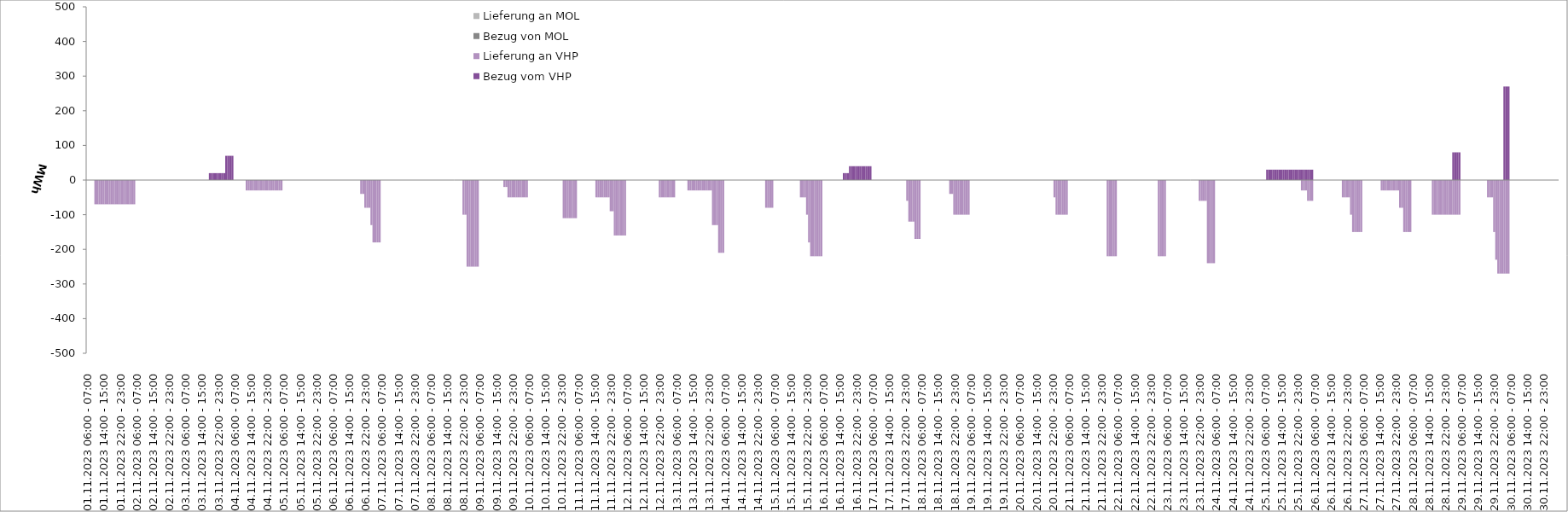
| Category | Bezug vom VHP | Lieferung an VHP | Bezug von MOL | Lieferung an MOL |
|---|---|---|---|---|
| 01.11.2023 06:00 - 07:00 | 0 | 0 | 0 | 0 |
| 01.11.2023 07:00 - 08:00 | 0 | 0 | 0 | 0 |
| 01.11.2023 08:00 - 09:00 | 0 | 0 | 0 | 0 |
| 01.11.2023 09:00 - 10:00 | 0 | 0 | 0 | 0 |
| 01.11.2023 10:00 - 11:00 | 0 | -70 | 0 | 0 |
| 01.11.2023 11:00 - 12:00 | 0 | -70 | 0 | 0 |
| 01.11.2023 12:00 - 13:00 | 0 | -70 | 0 | 0 |
| 01.11.2023 13:00 - 14:00 | 0 | -70 | 0 | 0 |
| 01.11.2023 14:00 - 15:00 | 0 | -70 | 0 | 0 |
| 01.11.2023 15:00 - 16:00 | 0 | -70 | 0 | 0 |
| 01.11.2023 16:00 - 17:00 | 0 | -70 | 0 | 0 |
| 01.11.2023 17:00 - 18:00 | 0 | -70 | 0 | 0 |
| 01.11.2023 18:00 - 19:00 | 0 | -70 | 0 | 0 |
| 01.11.2023 19:00 - 20:00 | 0 | -70 | 0 | 0 |
| 01.11.2023 20:00 - 21:00 | 0 | -70 | 0 | 0 |
| 01.11.2023 21:00 - 22:00 | 0 | -70 | 0 | 0 |
| 01.11.2023 22:00 - 23:00 | 0 | -70 | 0 | 0 |
| 01.11.2023 23:00 - 24:00 | 0 | -70 | 0 | 0 |
| 02.11.2023 00:00 - 01:00 | 0 | -70 | 0 | 0 |
| 02.11.2023 01:00 - 02:00 | 0 | -70 | 0 | 0 |
| 02.11.2023 02:00 - 03:00 | 0 | -70 | 0 | 0 |
| 02.11.2023 03:00 - 04:00 | 0 | -70 | 0 | 0 |
| 02.11.2023 04:00 - 05:00 | 0 | -70 | 0 | 0 |
| 02.11.2023 05:00 - 06:00 | 0 | -70 | 0 | 0 |
| 02.11.2023 06:00 - 07:00 | 0 | 0 | 0 | 0 |
| 02.11.2023 07:00 - 08:00 | 0 | 0 | 0 | 0 |
| 02.11.2023 08:00 - 09:00 | 0 | 0 | 0 | 0 |
| 02.11.2023 09:00 - 10:00 | 0 | 0 | 0 | 0 |
| 02.11.2023 10:00 - 11:00 | 0 | 0 | 0 | 0 |
| 02.11.2023 11:00 - 12:00 | 0 | 0 | 0 | 0 |
| 02.11.2023 12:00 - 13:00 | 0 | 0 | 0 | 0 |
| 02.11.2023 13:00 - 14:00 | 0 | 0 | 0 | 0 |
| 02.11.2023 14:00 - 15:00 | 0 | 0 | 0 | 0 |
| 02.11.2023 15:00 - 16:00 | 0 | 0 | 0 | 0 |
| 02.11.2023 16:00 - 17:00 | 0 | 0 | 0 | 0 |
| 02.11.2023 17:00 - 18:00 | 0 | 0 | 0 | 0 |
| 02.11.2023 18:00 - 19:00 | 0 | 0 | 0 | 0 |
| 02.11.2023 19:00 - 20:00 | 0 | 0 | 0 | 0 |
| 02.11.2023 20:00 - 21:00 | 0 | 0 | 0 | 0 |
| 02.11.2023 21:00 - 22:00 | 0 | 0 | 0 | 0 |
| 02.11.2023 22:00 - 23:00 | 0 | 0 | 0 | 0 |
| 02.11.2023 23:00 - 24:00 | 0 | 0 | 0 | 0 |
| 03.11.2023 00:00 - 01:00 | 0 | 0 | 0 | 0 |
| 03.11.2023 01:00 - 02:00 | 0 | 0 | 0 | 0 |
| 03.11.2023 02:00 - 03:00 | 0 | 0 | 0 | 0 |
| 03.11.2023 03:00 - 04:00 | 0 | 0 | 0 | 0 |
| 03.11.2023 04:00 - 05:00 | 0 | 0 | 0 | 0 |
| 03.11.2023 05:00 - 06:00 | 0 | 0 | 0 | 0 |
| 03.11.2023 06:00 - 07:00 | 0 | 0 | 0 | 0 |
| 03.11.2023 07:00 - 08:00 | 0 | 0 | 0 | 0 |
| 03.11.2023 08:00 - 09:00 | 0 | 0 | 0 | 0 |
| 03.11.2023 09:00 - 10:00 | 0 | 0 | 0 | 0 |
| 03.11.2023 10:00 - 11:00 | 0 | 0 | 0 | 0 |
| 03.11.2023 11:00 - 12:00 | 0 | 0 | 0 | 0 |
| 03.11.2023 12:00 - 13:00 | 0 | 0 | 0 | 0 |
| 03.11.2023 13:00 - 14:00 | 0 | 0 | 0 | 0 |
| 03.11.2023 14:00 - 15:00 | 0 | 0 | 0 | 0 |
| 03.11.2023 15:00 - 16:00 | 0 | 0 | 0 | 0 |
| 03.11.2023 16:00 - 17:00 | 0 | 0 | 0 | 0 |
| 03.11.2023 17:00 - 18:00 | 0 | 0 | 0 | 0 |
| 03.11.2023 18:00 - 19:00 | 20 | 0 | 0 | 0 |
| 03.11.2023 19:00 - 20:00 | 20 | 0 | 0 | 0 |
| 03.11.2023 20:00 - 21:00 | 20 | 0 | 0 | 0 |
| 03.11.2023 21:00 - 22:00 | 20 | 0 | 0 | 0 |
| 03.11.2023 22:00 - 23:00 | 20 | 0 | 0 | 0 |
| 03.11.2023 23:00 - 24:00 | 20 | 0 | 0 | 0 |
| 04.11.2023 00:00 - 01:00 | 20 | 0 | 0 | 0 |
| 04.11.2023 01:00 - 02:00 | 20 | 0 | 0 | 0 |
| 04.11.2023 02:00 - 03:00 | 70 | 0 | 0 | 0 |
| 04.11.2023 03:00 - 04:00 | 70 | 0 | 0 | 0 |
| 04.11.2023 04:00 - 05:00 | 70 | 0 | 0 | 0 |
| 04.11.2023 05:00 - 06:00 | 70 | 0 | 0 | 0 |
| 04.11.2023 06:00 - 07:00 | 0 | 0 | 0 | 0 |
| 04.11.2023 07:00 - 08:00 | 0 | 0 | 0 | 0 |
| 04.11.2023 08:00 - 09:00 | 0 | 0 | 0 | 0 |
| 04.11.2023 09:00 - 10:00 | 0 | 0 | 0 | 0 |
| 04.11.2023 10:00 - 11:00 | 0 | 0 | 0 | 0 |
| 04.11.2023 11:00 - 12:00 | 0 | 0 | 0 | 0 |
| 04.11.2023 12:00 - 13:00 | 0 | -30 | 0 | 0 |
| 04.11.2023 13:00 - 14:00 | 0 | -30 | 0 | 0 |
| 04.11.2023 14:00 - 15:00 | 0 | -30 | 0 | 0 |
| 04.11.2023 15:00 - 16:00 | 0 | -30 | 0 | 0 |
| 04.11.2023 16:00 - 17:00 | 0 | -30 | 0 | 0 |
| 04.11.2023 17:00 - 18:00 | 0 | -30 | 0 | 0 |
| 04.11.2023 18:00 - 19:00 | 0 | -30 | 0 | 0 |
| 04.11.2023 19:00 - 20:00 | 0 | -30 | 0 | 0 |
| 04.11.2023 20:00 - 21:00 | 0 | -30 | 0 | 0 |
| 04.11.2023 21:00 - 22:00 | 0 | -30 | 0 | 0 |
| 04.11.2023 22:00 - 23:00 | 0 | -30 | 0 | 0 |
| 04.11.2023 23:00 - 24:00 | 0 | -30 | 0 | 0 |
| 05.11.2023 00:00 - 01:00 | 0 | -30 | 0 | 0 |
| 05.11.2023 01:00 - 02:00 | 0 | -30 | 0 | 0 |
| 05.11.2023 02:00 - 03:00 | 0 | -30 | 0 | 0 |
| 05.11.2023 03:00 - 04:00 | 0 | -30 | 0 | 0 |
| 05.11.2023 04:00 - 05:00 | 0 | -30 | 0 | 0 |
| 05.11.2023 05:00 - 06:00 | 0 | -30 | 0 | 0 |
| 05.11.2023 06:00 - 07:00 | 0 | 0 | 0 | 0 |
| 05.11.2023 07:00 - 08:00 | 0 | 0 | 0 | 0 |
| 05.11.2023 08:00 - 09:00 | 0 | 0 | 0 | 0 |
| 05.11.2023 09:00 - 10:00 | 0 | 0 | 0 | 0 |
| 05.11.2023 10:00 - 11:00 | 0 | 0 | 0 | 0 |
| 05.11.2023 11:00 - 12:00 | 0 | 0 | 0 | 0 |
| 05.11.2023 12:00 - 13:00 | 0 | 0 | 0 | 0 |
| 05.11.2023 13:00 - 14:00 | 0 | 0 | 0 | 0 |
| 05.11.2023 14:00 - 15:00 | 0 | 0 | 0 | 0 |
| 05.11.2023 15:00 - 16:00 | 0 | 0 | 0 | 0 |
| 05.11.2023 16:00 - 17:00 | 0 | 0 | 0 | 0 |
| 05.11.2023 17:00 - 18:00 | 0 | 0 | 0 | 0 |
| 05.11.2023 18:00 - 19:00 | 0 | 0 | 0 | 0 |
| 05.11.2023 19:00 - 20:00 | 0 | 0 | 0 | 0 |
| 05.11.2023 20:00 - 21:00 | 0 | 0 | 0 | 0 |
| 05.11.2023 21:00 - 22:00 | 0 | 0 | 0 | 0 |
| 05.11.2023 22:00 - 23:00 | 0 | 0 | 0 | 0 |
| 05.11.2023 23:00 - 24:00 | 0 | 0 | 0 | 0 |
| 06.11.2023 00:00 - 01:00 | 0 | 0 | 0 | 0 |
| 06.11.2023 01:00 - 02:00 | 0 | 0 | 0 | 0 |
| 06.11.2023 02:00 - 03:00 | 0 | 0 | 0 | 0 |
| 06.11.2023 03:00 - 04:00 | 0 | 0 | 0 | 0 |
| 06.11.2023 04:00 - 05:00 | 0 | 0 | 0 | 0 |
| 06.11.2023 05:00 - 06:00 | 0 | 0 | 0 | 0 |
| 06.11.2023 06:00 - 07:00 | 0 | 0 | 0 | 0 |
| 06.11.2023 07:00 - 08:00 | 0 | 0 | 0 | 0 |
| 06.11.2023 08:00 - 09:00 | 0 | 0 | 0 | 0 |
| 06.11.2023 09:00 - 10:00 | 0 | 0 | 0 | 0 |
| 06.11.2023 10:00 - 11:00 | 0 | 0 | 0 | 0 |
| 06.11.2023 11:00 - 12:00 | 0 | 0 | 0 | 0 |
| 06.11.2023 12:00 - 13:00 | 0 | 0 | 0 | 0 |
| 06.11.2023 13:00 - 14:00 | 0 | 0 | 0 | 0 |
| 06.11.2023 14:00 - 15:00 | 0 | 0 | 0 | 0 |
| 06.11.2023 15:00 - 16:00 | 0 | 0 | 0 | 0 |
| 06.11.2023 16:00 - 17:00 | 0 | 0 | 0 | 0 |
| 06.11.2023 17:00 - 18:00 | 0 | 0 | 0 | 0 |
| 06.11.2023 18:00 - 19:00 | 0 | 0 | 0 | 0 |
| 06.11.2023 19:00 - 20:00 | 0 | 0 | 0 | 0 |
| 06.11.2023 20:00 - 21:00 | 0 | -40 | 0 | 0 |
| 06.11.2023 21:00 - 22:00 | 0 | -40 | 0 | 0 |
| 06.11.2023 22:00 - 23:00 | 0 | -80 | 0 | 0 |
| 06.11.2023 23:00 - 24:00 | 0 | -80 | 0 | 0 |
| 07.11.2023 00:00 - 01:00 | 0 | -80 | 0 | 0 |
| 07.11.2023 01:00 - 02:00 | 0 | -130 | 0 | 0 |
| 07.11.2023 02:00 - 03:00 | 0 | -180 | 0 | 0 |
| 07.11.2023 03:00 - 04:00 | 0 | -180 | 0 | 0 |
| 07.11.2023 04:00 - 05:00 | 0 | -180 | 0 | 0 |
| 07.11.2023 05:00 - 06:00 | 0 | -180 | 0 | 0 |
| 07.11.2023 06:00 - 07:00 | 0 | 0 | 0 | 0 |
| 07.11.2023 07:00 - 08:00 | 0 | 0 | 0 | 0 |
| 07.11.2023 08:00 - 09:00 | 0 | 0 | 0 | 0 |
| 07.11.2023 09:00 - 10:00 | 0 | 0 | 0 | 0 |
| 07.11.2023 10:00 - 11:00 | 0 | 0 | 0 | 0 |
| 07.11.2023 11:00 - 12:00 | 0 | 0 | 0 | 0 |
| 07.11.2023 12:00 - 13:00 | 0 | 0 | 0 | 0 |
| 07.11.2023 13:00 - 14:00 | 0 | 0 | 0 | 0 |
| 07.11.2023 14:00 - 15:00 | 0 | 0 | 0 | 0 |
| 07.11.2023 15:00 - 16:00 | 0 | 0 | 0 | 0 |
| 07.11.2023 16:00 - 17:00 | 0 | 0 | 0 | 0 |
| 07.11.2023 17:00 - 18:00 | 0 | 0 | 0 | 0 |
| 07.11.2023 18:00 - 19:00 | 0 | 0 | 0 | 0 |
| 07.11.2023 19:00 - 20:00 | 0 | 0 | 0 | 0 |
| 07.11.2023 20:00 - 21:00 | 0 | 0 | 0 | 0 |
| 07.11.2023 21:00 - 22:00 | 0 | 0 | 0 | 0 |
| 07.11.2023 22:00 - 23:00 | 0 | 0 | 0 | 0 |
| 07.11.2023 23:00 - 24:00 | 0 | 0 | 0 | 0 |
| 08.11.2023 00:00 - 01:00 | 0 | 0 | 0 | 0 |
| 08.11.2023 01:00 - 02:00 | 0 | 0 | 0 | 0 |
| 08.11.2023 02:00 - 03:00 | 0 | 0 | 0 | 0 |
| 08.11.2023 03:00 - 04:00 | 0 | 0 | 0 | 0 |
| 08.11.2023 04:00 - 05:00 | 0 | 0 | 0 | 0 |
| 08.11.2023 05:00 - 06:00 | 0 | 0 | 0 | 0 |
| 08.11.2023 06:00 - 07:00 | 0 | 0 | 0 | 0 |
| 08.11.2023 07:00 - 08:00 | 0 | 0 | 0 | 0 |
| 08.11.2023 08:00 - 09:00 | 0 | 0 | 0 | 0 |
| 08.11.2023 09:00 - 10:00 | 0 | 0 | 0 | 0 |
| 08.11.2023 10:00 - 11:00 | 0 | 0 | 0 | 0 |
| 08.11.2023 11:00 - 12:00 | 0 | 0 | 0 | 0 |
| 08.11.2023 12:00 - 13:00 | 0 | 0 | 0 | 0 |
| 08.11.2023 13:00 - 14:00 | 0 | 0 | 0 | 0 |
| 08.11.2023 14:00 - 15:00 | 0 | 0 | 0 | 0 |
| 08.11.2023 15:00 - 16:00 | 0 | 0 | 0 | 0 |
| 08.11.2023 16:00 - 17:00 | 0 | 0 | 0 | 0 |
| 08.11.2023 17:00 - 18:00 | 0 | 0 | 0 | 0 |
| 08.11.2023 18:00 - 19:00 | 0 | 0 | 0 | 0 |
| 08.11.2023 19:00 - 20:00 | 0 | 0 | 0 | 0 |
| 08.11.2023 20:00 - 21:00 | 0 | 0 | 0 | 0 |
| 08.11.2023 21:00 - 22:00 | 0 | 0 | 0 | 0 |
| 08.11.2023 22:00 - 23:00 | 0 | -100 | 0 | 0 |
| 08.11.2023 23:00 - 24:00 | 0 | -100 | 0 | 0 |
| 09.11.2023 00:00 - 01:00 | 0 | -250 | 0 | 0 |
| 09.11.2023 01:00 - 02:00 | 0 | -250 | 0 | 0 |
| 09.11.2023 02:00 - 03:00 | 0 | -250 | 0 | 0 |
| 09.11.2023 03:00 - 04:00 | 0 | -250 | 0 | 0 |
| 09.11.2023 04:00 - 05:00 | 0 | -250 | 0 | 0 |
| 09.11.2023 05:00 - 06:00 | 0 | -250 | 0 | 0 |
| 09.11.2023 06:00 - 07:00 | 0 | 0 | 0 | 0 |
| 09.11.2023 07:00 - 08:00 | 0 | 0 | 0 | 0 |
| 09.11.2023 08:00 - 09:00 | 0 | 0 | 0 | 0 |
| 09.11.2023 09:00 - 10:00 | 0 | 0 | 0 | 0 |
| 09.11.2023 10:00 - 11:00 | 0 | 0 | 0 | 0 |
| 09.11.2023 11:00 - 12:00 | 0 | 0 | 0 | 0 |
| 09.11.2023 12:00 - 13:00 | 0 | 0 | 0 | 0 |
| 09.11.2023 13:00 - 14:00 | 0 | 0 | 0 | 0 |
| 09.11.2023 14:00 - 15:00 | 0 | 0 | 0 | 0 |
| 09.11.2023 15:00 - 16:00 | 0 | 0 | 0 | 0 |
| 09.11.2023 16:00 - 17:00 | 0 | 0 | 0 | 0 |
| 09.11.2023 17:00 - 18:00 | 0 | 0 | 0 | 0 |
| 09.11.2023 18:00 - 19:00 | 0 | -20 | 0 | 0 |
| 09.11.2023 19:00 - 20:00 | 0 | -20 | 0 | 0 |
| 09.11.2023 20:00 - 21:00 | 0 | -50 | 0 | 0 |
| 09.11.2023 21:00 - 22:00 | 0 | -50 | 0 | 0 |
| 09.11.2023 22:00 - 23:00 | 0 | -50 | 0 | 0 |
| 09.11.2023 23:00 - 24:00 | 0 | -50 | 0 | 0 |
| 10.11.2023 00:00 - 01:00 | 0 | -50 | 0 | 0 |
| 10.11.2023 01:00 - 02:00 | 0 | -50 | 0 | 0 |
| 10.11.2023 02:00 - 03:00 | 0 | -50 | 0 | 0 |
| 10.11.2023 03:00 - 04:00 | 0 | -50 | 0 | 0 |
| 10.11.2023 04:00 - 05:00 | 0 | -50 | 0 | 0 |
| 10.11.2023 05:00 - 06:00 | 0 | -50 | 0 | 0 |
| 10.11.2023 06:00 - 07:00 | 0 | 0 | 0 | 0 |
| 10.11.2023 07:00 - 08:00 | 0 | 0 | 0 | 0 |
| 10.11.2023 08:00 - 09:00 | 0 | 0 | 0 | 0 |
| 10.11.2023 09:00 - 10:00 | 0 | 0 | 0 | 0 |
| 10.11.2023 10:00 - 11:00 | 0 | 0 | 0 | 0 |
| 10.11.2023 11:00 - 12:00 | 0 | 0 | 0 | 0 |
| 10.11.2023 12:00 - 13:00 | 0 | 0 | 0 | 0 |
| 10.11.2023 13:00 - 14:00 | 0 | 0 | 0 | 0 |
| 10.11.2023 14:00 - 15:00 | 0 | 0 | 0 | 0 |
| 10.11.2023 15:00 - 16:00 | 0 | 0 | 0 | 0 |
| 10.11.2023 16:00 - 17:00 | 0 | 0 | 0 | 0 |
| 10.11.2023 17:00 - 18:00 | 0 | 0 | 0 | 0 |
| 10.11.2023 18:00 - 19:00 | 0 | 0 | 0 | 0 |
| 10.11.2023 19:00 - 20:00 | 0 | 0 | 0 | 0 |
| 10.11.2023 20:00 - 21:00 | 0 | 0 | 0 | 0 |
| 10.11.2023 21:00 - 22:00 | 0 | 0 | 0 | 0 |
| 10.11.2023 22:00 - 23:00 | 0 | 0 | 0 | 0 |
| 10.11.2023 23:00 - 24:00 | 0 | -110 | 0 | 0 |
| 11.11.2023 00:00 - 01:00 | 0 | -110 | 0 | 0 |
| 11.11.2023 01:00 - 02:00 | 0 | -110 | 0 | 0 |
| 11.11.2023 02:00 - 03:00 | 0 | -110 | 0 | 0 |
| 11.11.2023 03:00 - 04:00 | 0 | -110 | 0 | 0 |
| 11.11.2023 04:00 - 05:00 | 0 | -110 | 0 | 0 |
| 11.11.2023 05:00 - 06:00 | 0 | -110 | 0 | 0 |
| 11.11.2023 06:00 - 07:00 | 0 | 0 | 0 | 0 |
| 11.11.2023 07:00 - 08:00 | 0 | 0 | 0 | 0 |
| 11.11.2023 08:00 - 09:00 | 0 | 0 | 0 | 0 |
| 11.11.2023 09:00 - 10:00 | 0 | 0 | 0 | 0 |
| 11.11.2023 10:00 - 11:00 | 0 | 0 | 0 | 0 |
| 11.11.2023 11:00 - 12:00 | 0 | 0 | 0 | 0 |
| 11.11.2023 12:00 - 13:00 | 0 | 0 | 0 | 0 |
| 11.11.2023 13:00 - 14:00 | 0 | 0 | 0 | 0 |
| 11.11.2023 14:00 - 15:00 | 0 | 0 | 0 | 0 |
| 11.11.2023 15:00 - 16:00 | 0 | -50 | 0 | 0 |
| 11.11.2023 16:00 - 17:00 | 0 | -50 | 0 | 0 |
| 11.11.2023 17:00 - 18:00 | 0 | -50 | 0 | 0 |
| 11.11.2023 18:00 - 19:00 | 0 | -50 | 0 | 0 |
| 11.11.2023 19:00 - 20:00 | 0 | -50 | 0 | 0 |
| 11.11.2023 20:00 - 21:00 | 0 | -50 | 0 | 0 |
| 11.11.2023 21:00 - 22:00 | 0 | -50 | 0 | 0 |
| 11.11.2023 22:00 - 23:00 | 0 | -90 | 0 | 0 |
| 11.11.2023 23:00 - 24:00 | 0 | -90 | 0 | 0 |
| 12.11.2023 00:00 - 01:00 | 0 | -160 | 0 | 0 |
| 12.11.2023 01:00 - 02:00 | 0 | -160 | 0 | 0 |
| 12.11.2023 02:00 - 03:00 | 0 | -160 | 0 | 0 |
| 12.11.2023 03:00 - 04:00 | 0 | -160 | 0 | 0 |
| 12.11.2023 04:00 - 05:00 | 0 | -160 | 0 | 0 |
| 12.11.2023 05:00 - 06:00 | 0 | -160 | 0 | 0 |
| 12.11.2023 06:00 - 07:00 | 0 | 0 | 0 | 0 |
| 12.11.2023 07:00 - 08:00 | 0 | 0 | 0 | 0 |
| 12.11.2023 08:00 - 09:00 | 0 | 0 | 0 | 0 |
| 12.11.2023 09:00 - 10:00 | 0 | 0 | 0 | 0 |
| 12.11.2023 10:00 - 11:00 | 0 | 0 | 0 | 0 |
| 12.11.2023 11:00 - 12:00 | 0 | 0 | 0 | 0 |
| 12.11.2023 12:00 - 13:00 | 0 | 0 | 0 | 0 |
| 12.11.2023 13:00 - 14:00 | 0 | 0 | 0 | 0 |
| 12.11.2023 14:00 - 15:00 | 0 | 0 | 0 | 0 |
| 12.11.2023 15:00 - 16:00 | 0 | 0 | 0 | 0 |
| 12.11.2023 16:00 - 17:00 | 0 | 0 | 0 | 0 |
| 12.11.2023 17:00 - 18:00 | 0 | 0 | 0 | 0 |
| 12.11.2023 18:00 - 19:00 | 0 | 0 | 0 | 0 |
| 12.11.2023 19:00 - 20:00 | 0 | 0 | 0 | 0 |
| 12.11.2023 20:00 - 21:00 | 0 | 0 | 0 | 0 |
| 12.11.2023 21:00 - 22:00 | 0 | 0 | 0 | 0 |
| 12.11.2023 22:00 - 23:00 | 0 | -50 | 0 | 0 |
| 12.11.2023 23:00 - 24:00 | 0 | -50 | 0 | 0 |
| 13.11.2023 00:00 - 01:00 | 0 | -50 | 0 | 0 |
| 13.11.2023 01:00 - 02:00 | 0 | -50 | 0 | 0 |
| 13.11.2023 02:00 - 03:00 | 0 | -50 | 0 | 0 |
| 13.11.2023 03:00 - 04:00 | 0 | -50 | 0 | 0 |
| 13.11.2023 04:00 - 05:00 | 0 | -50 | 0 | 0 |
| 13.11.2023 05:00 - 06:00 | 0 | -50 | 0 | 0 |
| 13.11.2023 06:00 - 07:00 | 0 | 0 | 0 | 0 |
| 13.11.2023 07:00 - 08:00 | 0 | 0 | 0 | 0 |
| 13.11.2023 08:00 - 09:00 | 0 | 0 | 0 | 0 |
| 13.11.2023 09:00 - 10:00 | 0 | 0 | 0 | 0 |
| 13.11.2023 10:00 - 11:00 | 0 | 0 | 0 | 0 |
| 13.11.2023 11:00 - 12:00 | 0 | 0 | 0 | 0 |
| 13.11.2023 12:00 - 13:00 | 0 | -30 | 0 | 0 |
| 13.11.2023 13:00 - 14:00 | 0 | -30 | 0 | 0 |
| 13.11.2023 14:00 - 15:00 | 0 | -30 | 0 | 0 |
| 13.11.2023 15:00 - 16:00 | 0 | -30 | 0 | 0 |
| 13.11.2023 16:00 - 17:00 | 0 | -30 | 0 | 0 |
| 13.11.2023 17:00 - 18:00 | 0 | -30 | 0 | 0 |
| 13.11.2023 18:00 - 19:00 | 0 | -30 | 0 | 0 |
| 13.11.2023 19:00 - 20:00 | 0 | -30 | 0 | 0 |
| 13.11.2023 20:00 - 21:00 | 0 | -30 | 0 | 0 |
| 13.11.2023 21:00 - 22:00 | 0 | -30 | 0 | 0 |
| 13.11.2023 22:00 - 23:00 | 0 | -30 | 0 | 0 |
| 13.11.2023 23:00 - 24:00 | 0 | -30 | 0 | 0 |
| 14.11.2023 00:00 - 01:00 | 0 | -130 | 0 | 0 |
| 14.11.2023 01:00 - 02:00 | 0 | -130 | 0 | 0 |
| 14.11.2023 02:00 - 03:00 | 0 | -130 | 0 | 0 |
| 14.11.2023 03:00 - 04:00 | 0 | -210 | 0 | 0 |
| 14.11.2023 04:00 - 05:00 | 0 | -210 | 0 | 0 |
| 14.11.2023 05:00 - 06:00 | 0 | -210 | 0 | 0 |
| 14.11.2023 06:00 - 07:00 | 0 | 0 | 0 | 0 |
| 14.11.2023 07:00 - 08:00 | 0 | 0 | 0 | 0 |
| 14.11.2023 08:00 - 09:00 | 0 | 0 | 0 | 0 |
| 14.11.2023 09:00 - 10:00 | 0 | 0 | 0 | 0 |
| 14.11.2023 10:00 - 11:00 | 0 | 0 | 0 | 0 |
| 14.11.2023 11:00 - 12:00 | 0 | 0 | 0 | 0 |
| 14.11.2023 12:00 - 13:00 | 0 | 0 | 0 | 0 |
| 14.11.2023 13:00 - 14:00 | 0 | 0 | 0 | 0 |
| 14.11.2023 14:00 - 15:00 | 0 | 0 | 0 | 0 |
| 14.11.2023 15:00 - 16:00 | 0 | 0 | 0 | 0 |
| 14.11.2023 16:00 - 17:00 | 0 | 0 | 0 | 0 |
| 14.11.2023 17:00 - 18:00 | 0 | 0 | 0 | 0 |
| 14.11.2023 18:00 - 19:00 | 0 | 0 | 0 | 0 |
| 14.11.2023 19:00 - 20:00 | 0 | 0 | 0 | 0 |
| 14.11.2023 20:00 - 21:00 | 0 | 0 | 0 | 0 |
| 14.11.2023 21:00 - 22:00 | 0 | 0 | 0 | 0 |
| 14.11.2023 22:00 - 23:00 | 0 | 0 | 0 | 0 |
| 14.11.2023 23:00 - 24:00 | 0 | 0 | 0 | 0 |
| 15.11.2023 00:00 - 01:00 | 0 | 0 | 0 | 0 |
| 15.11.2023 01:00 - 02:00 | 0 | 0 | 0 | 0 |
| 15.11.2023 02:00 - 03:00 | 0 | -80 | 0 | 0 |
| 15.11.2023 03:00 - 04:00 | 0 | -80 | 0 | 0 |
| 15.11.2023 04:00 - 05:00 | 0 | -80 | 0 | 0 |
| 15.11.2023 05:00 - 06:00 | 0 | -80 | 0 | 0 |
| 15.11.2023 06:00 - 07:00 | 0 | 0 | 0 | 0 |
| 15.11.2023 07:00 - 08:00 | 0 | 0 | 0 | 0 |
| 15.11.2023 08:00 - 09:00 | 0 | 0 | 0 | 0 |
| 15.11.2023 09:00 - 10:00 | 0 | 0 | 0 | 0 |
| 15.11.2023 10:00 - 11:00 | 0 | 0 | 0 | 0 |
| 15.11.2023 11:00 - 12:00 | 0 | 0 | 0 | 0 |
| 15.11.2023 12:00 - 13:00 | 0 | 0 | 0 | 0 |
| 15.11.2023 13:00 - 14:00 | 0 | 0 | 0 | 0 |
| 15.11.2023 14:00 - 15:00 | 0 | 0 | 0 | 0 |
| 15.11.2023 15:00 - 16:00 | 0 | 0 | 0 | 0 |
| 15.11.2023 16:00 - 17:00 | 0 | 0 | 0 | 0 |
| 15.11.2023 17:00 - 18:00 | 0 | 0 | 0 | 0 |
| 15.11.2023 18:00 - 19:00 | 0 | 0 | 0 | 0 |
| 15.11.2023 19:00 - 20:00 | 0 | -50 | 0 | 0 |
| 15.11.2023 20:00 - 21:00 | 0 | -50 | 0 | 0 |
| 15.11.2023 21:00 - 22:00 | 0 | -50 | 0 | 0 |
| 15.11.2023 22:00 - 23:00 | 0 | -100 | 0 | 0 |
| 15.11.2023 23:00 - 24:00 | 0 | -180 | 0 | 0 |
| 16.11.2023 00:00 - 01:00 | 0 | -220 | 0 | 0 |
| 16.11.2023 01:00 - 02:00 | 0 | -220 | 0 | 0 |
| 16.11.2023 02:00 - 03:00 | 0 | -220 | 0 | 0 |
| 16.11.2023 03:00 - 04:00 | 0 | -220 | 0 | 0 |
| 16.11.2023 04:00 - 05:00 | 0 | -220 | 0 | 0 |
| 16.11.2023 05:00 - 06:00 | 0 | -220 | 0 | 0 |
| 16.11.2023 06:00 - 07:00 | 0 | 0 | 0 | 0 |
| 16.11.2023 07:00 - 08:00 | 0 | 0 | 0 | 0 |
| 16.11.2023 08:00 - 09:00 | 0 | 0 | 0 | 0 |
| 16.11.2023 09:00 - 10:00 | 0 | 0 | 0 | 0 |
| 16.11.2023 10:00 - 11:00 | 0 | 0 | 0 | 0 |
| 16.11.2023 11:00 - 12:00 | 0 | 0 | 0 | 0 |
| 16.11.2023 12:00 - 13:00 | 0 | 0 | 0 | 0 |
| 16.11.2023 13:00 - 14:00 | 0 | 0 | 0 | 0 |
| 16.11.2023 14:00 - 15:00 | 0 | 0 | 0 | 0 |
| 16.11.2023 15:00 - 16:00 | 0 | 0 | 0 | 0 |
| 16.11.2023 16:00 - 17:00 | 20 | 0 | 0 | 0 |
| 16.11.2023 17:00 - 18:00 | 20 | 0 | 0 | 0 |
| 16.11.2023 18:00 - 19:00 | 20 | 0 | 0 | 0 |
| 16.11.2023 19:00 - 20:00 | 40 | 0 | 0 | 0 |
| 16.11.2023 20:00 - 21:00 | 40 | 0 | 0 | 0 |
| 16.11.2023 21:00 - 22:00 | 40 | 0 | 0 | 0 |
| 16.11.2023 22:00 - 23:00 | 40 | 0 | 0 | 0 |
| 16.11.2023 23:00 - 24:00 | 40 | 0 | 0 | 0 |
| 17.11.2023 00:00 - 01:00 | 40 | 0 | 0 | 0 |
| 17.11.2023 01:00 - 02:00 | 40 | 0 | 0 | 0 |
| 17.11.2023 02:00 - 03:00 | 40 | 0 | 0 | 0 |
| 17.11.2023 03:00 - 04:00 | 40 | 0 | 0 | 0 |
| 17.11.2023 04:00 - 05:00 | 40 | 0 | 0 | 0 |
| 17.11.2023 05:00 - 06:00 | 40 | 0 | 0 | 0 |
| 17.11.2023 06:00 - 07:00 | 0 | 0 | 0 | 0 |
| 17.11.2023 07:00 - 08:00 | 0 | 0 | 0 | 0 |
| 17.11.2023 08:00 - 09:00 | 0 | 0 | 0 | 0 |
| 17.11.2023 09:00 - 10:00 | 0 | 0 | 0 | 0 |
| 17.11.2023 10:00 - 11:00 | 0 | 0 | 0 | 0 |
| 17.11.2023 11:00 - 12:00 | 0 | 0 | 0 | 0 |
| 17.11.2023 12:00 - 13:00 | 0 | 0 | 0 | 0 |
| 17.11.2023 13:00 - 14:00 | 0 | 0 | 0 | 0 |
| 17.11.2023 14:00 - 15:00 | 0 | 0 | 0 | 0 |
| 17.11.2023 15:00 - 16:00 | 0 | 0 | 0 | 0 |
| 17.11.2023 16:00 - 17:00 | 0 | 0 | 0 | 0 |
| 17.11.2023 17:00 - 18:00 | 0 | 0 | 0 | 0 |
| 17.11.2023 18:00 - 19:00 | 0 | 0 | 0 | 0 |
| 17.11.2023 19:00 - 20:00 | 0 | 0 | 0 | 0 |
| 17.11.2023 20:00 - 21:00 | 0 | 0 | 0 | 0 |
| 17.11.2023 21:00 - 22:00 | 0 | 0 | 0 | 0 |
| 17.11.2023 22:00 - 23:00 | 0 | 0 | 0 | 0 |
| 17.11.2023 23:00 - 24:00 | 0 | -60 | 0 | 0 |
| 18.11.2023 00:00 - 01:00 | 0 | -120 | 0 | 0 |
| 18.11.2023 01:00 - 02:00 | 0 | -120 | 0 | 0 |
| 18.11.2023 02:00 - 03:00 | 0 | -120 | 0 | 0 |
| 18.11.2023 03:00 - 04:00 | 0 | -170 | 0 | 0 |
| 18.11.2023 04:00 - 05:00 | 0 | -170 | 0 | 0 |
| 18.11.2023 05:00 - 06:00 | 0 | -170 | 0 | 0 |
| 18.11.2023 06:00 - 07:00 | 0 | 0 | 0 | 0 |
| 18.11.2023 07:00 - 08:00 | 0 | 0 | 0 | 0 |
| 18.11.2023 08:00 - 09:00 | 0 | 0 | 0 | 0 |
| 18.11.2023 09:00 - 10:00 | 0 | 0 | 0 | 0 |
| 18.11.2023 10:00 - 11:00 | 0 | 0 | 0 | 0 |
| 18.11.2023 11:00 - 12:00 | 0 | 0 | 0 | 0 |
| 18.11.2023 12:00 - 13:00 | 0 | 0 | 0 | 0 |
| 18.11.2023 13:00 - 14:00 | 0 | 0 | 0 | 0 |
| 18.11.2023 14:00 - 15:00 | 0 | 0 | 0 | 0 |
| 18.11.2023 15:00 - 16:00 | 0 | 0 | 0 | 0 |
| 18.11.2023 16:00 - 17:00 | 0 | 0 | 0 | 0 |
| 18.11.2023 17:00 - 18:00 | 0 | 0 | 0 | 0 |
| 18.11.2023 18:00 - 19:00 | 0 | 0 | 0 | 0 |
| 18.11.2023 19:00 - 20:00 | 0 | 0 | 0 | 0 |
| 18.11.2023 20:00 - 21:00 | 0 | -40 | 0 | 0 |
| 18.11.2023 21:00 - 22:00 | 0 | -40 | 0 | 0 |
| 18.11.2023 22:00 - 23:00 | 0 | -100 | 0 | 0 |
| 18.11.2023 23:00 - 24:00 | 0 | -100 | 0 | 0 |
| 19.11.2023 00:00 - 01:00 | 0 | -100 | 0 | 0 |
| 19.11.2023 01:00 - 02:00 | 0 | -100 | 0 | 0 |
| 19.11.2023 02:00 - 03:00 | 0 | -100 | 0 | 0 |
| 19.11.2023 03:00 - 04:00 | 0 | -100 | 0 | 0 |
| 19.11.2023 04:00 - 05:00 | 0 | -100 | 0 | 0 |
| 19.11.2023 05:00 - 06:00 | 0 | -100 | 0 | 0 |
| 19.11.2023 06:00 - 07:00 | 0 | 0 | 0 | 0 |
| 19.11.2023 07:00 - 08:00 | 0 | 0 | 0 | 0 |
| 19.11.2023 08:00 - 09:00 | 0 | 0 | 0 | 0 |
| 19.11.2023 09:00 - 10:00 | 0 | 0 | 0 | 0 |
| 19.11.2023 10:00 - 11:00 | 0 | 0 | 0 | 0 |
| 19.11.2023 11:00 - 12:00 | 0 | 0 | 0 | 0 |
| 19.11.2023 12:00 - 13:00 | 0 | 0 | 0 | 0 |
| 19.11.2023 13:00 - 14:00 | 0 | 0 | 0 | 0 |
| 19.11.2023 14:00 - 15:00 | 0 | 0 | 0 | 0 |
| 19.11.2023 15:00 - 16:00 | 0 | 0 | 0 | 0 |
| 19.11.2023 16:00 - 17:00 | 0 | 0 | 0 | 0 |
| 19.11.2023 17:00 - 18:00 | 0 | 0 | 0 | 0 |
| 19.11.2023 18:00 - 19:00 | 0 | 0 | 0 | 0 |
| 19.11.2023 19:00 - 20:00 | 0 | 0 | 0 | 0 |
| 19.11.2023 20:00 - 21:00 | 0 | 0 | 0 | 0 |
| 19.11.2023 21:00 - 22:00 | 0 | 0 | 0 | 0 |
| 19.11.2023 22:00 - 23:00 | 0 | 0 | 0 | 0 |
| 19.11.2023 23:00 - 24:00 | 0 | 0 | 0 | 0 |
| 20.11.2023 00:00 - 01:00 | 0 | 0 | 0 | 0 |
| 20.11.2023 01:00 - 02:00 | 0 | 0 | 0 | 0 |
| 20.11.2023 02:00 - 03:00 | 0 | 0 | 0 | 0 |
| 20.11.2023 03:00 - 04:00 | 0 | 0 | 0 | 0 |
| 20.11.2023 04:00 - 05:00 | 0 | 0 | 0 | 0 |
| 20.11.2023 05:00 - 06:00 | 0 | 0 | 0 | 0 |
| 20.11.2023 06:00 - 07:00 | 0 | 0 | 0 | 0 |
| 20.11.2023 07:00 - 08:00 | 0 | 0 | 0 | 0 |
| 20.11.2023 08:00 - 09:00 | 0 | 0 | 0 | 0 |
| 20.11.2023 09:00 - 10:00 | 0 | 0 | 0 | 0 |
| 20.11.2023 10:00 - 11:00 | 0 | 0 | 0 | 0 |
| 20.11.2023 11:00 - 12:00 | 0 | 0 | 0 | 0 |
| 20.11.2023 12:00 - 13:00 | 0 | 0 | 0 | 0 |
| 20.11.2023 13:00 - 14:00 | 0 | 0 | 0 | 0 |
| 20.11.2023 14:00 - 15:00 | 0 | 0 | 0 | 0 |
| 20.11.2023 15:00 - 16:00 | 0 | 0 | 0 | 0 |
| 20.11.2023 16:00 - 17:00 | 0 | 0 | 0 | 0 |
| 20.11.2023 17:00 - 18:00 | 0 | 0 | 0 | 0 |
| 20.11.2023 18:00 - 19:00 | 0 | 0 | 0 | 0 |
| 20.11.2023 19:00 - 20:00 | 0 | 0 | 0 | 0 |
| 20.11.2023 20:00 - 21:00 | 0 | 0 | 0 | 0 |
| 20.11.2023 21:00 - 22:00 | 0 | 0 | 0 | 0 |
| 20.11.2023 22:00 - 23:00 | 0 | 0 | 0 | 0 |
| 20.11.2023 23:00 - 24:00 | 0 | -50 | 0 | 0 |
| 21.11.2023 00:00 - 01:00 | 0 | -100 | 0 | 0 |
| 21.11.2023 01:00 - 02:00 | 0 | -100 | 0 | 0 |
| 21.11.2023 02:00 - 03:00 | 0 | -100 | 0 | 0 |
| 21.11.2023 03:00 - 04:00 | 0 | -100 | 0 | 0 |
| 21.11.2023 04:00 - 05:00 | 0 | -100 | 0 | 0 |
| 21.11.2023 05:00 - 06:00 | 0 | -100 | 0 | 0 |
| 21.11.2023 06:00 - 07:00 | 0 | 0 | 0 | 0 |
| 21.11.2023 07:00 - 08:00 | 0 | 0 | 0 | 0 |
| 21.11.2023 08:00 - 09:00 | 0 | 0 | 0 | 0 |
| 21.11.2023 09:00 - 10:00 | 0 | 0 | 0 | 0 |
| 21.11.2023 10:00 - 11:00 | 0 | 0 | 0 | 0 |
| 21.11.2023 11:00 - 12:00 | 0 | 0 | 0 | 0 |
| 21.11.2023 12:00 - 13:00 | 0 | 0 | 0 | 0 |
| 21.11.2023 13:00 - 14:00 | 0 | 0 | 0 | 0 |
| 21.11.2023 14:00 - 15:00 | 0 | 0 | 0 | 0 |
| 21.11.2023 15:00 - 16:00 | 0 | 0 | 0 | 0 |
| 21.11.2023 16:00 - 17:00 | 0 | 0 | 0 | 0 |
| 21.11.2023 17:00 - 18:00 | 0 | 0 | 0 | 0 |
| 21.11.2023 18:00 - 19:00 | 0 | 0 | 0 | 0 |
| 21.11.2023 19:00 - 20:00 | 0 | 0 | 0 | 0 |
| 21.11.2023 20:00 - 21:00 | 0 | 0 | 0 | 0 |
| 21.11.2023 21:00 - 22:00 | 0 | 0 | 0 | 0 |
| 21.11.2023 22:00 - 23:00 | 0 | 0 | 0 | 0 |
| 21.11.2023 23:00 - 24:00 | 0 | 0 | 0 | 0 |
| 22.11.2023 00:00 - 01:00 | 0 | 0 | 0 | 0 |
| 22.11.2023 01:00 - 02:00 | 0 | -220 | 0 | 0 |
| 22.11.2023 02:00 - 03:00 | 0 | -220 | 0 | 0 |
| 22.11.2023 03:00 - 04:00 | 0 | -220 | 0 | 0 |
| 22.11.2023 04:00 - 05:00 | 0 | -220 | 0 | 0 |
| 22.11.2023 05:00 - 06:00 | 0 | -220 | 0 | 0 |
| 22.11.2023 06:00 - 07:00 | 0 | 0 | 0 | 0 |
| 22.11.2023 07:00 - 08:00 | 0 | 0 | 0 | 0 |
| 22.11.2023 08:00 - 09:00 | 0 | 0 | 0 | 0 |
| 22.11.2023 09:00 - 10:00 | 0 | 0 | 0 | 0 |
| 22.11.2023 10:00 - 11:00 | 0 | 0 | 0 | 0 |
| 22.11.2023 11:00 - 12:00 | 0 | 0 | 0 | 0 |
| 22.11.2023 12:00 - 13:00 | 0 | 0 | 0 | 0 |
| 22.11.2023 13:00 - 14:00 | 0 | 0 | 0 | 0 |
| 22.11.2023 14:00 - 15:00 | 0 | 0 | 0 | 0 |
| 22.11.2023 15:00 - 16:00 | 0 | 0 | 0 | 0 |
| 22.11.2023 16:00 - 17:00 | 0 | 0 | 0 | 0 |
| 22.11.2023 17:00 - 18:00 | 0 | 0 | 0 | 0 |
| 22.11.2023 18:00 - 19:00 | 0 | 0 | 0 | 0 |
| 22.11.2023 19:00 - 20:00 | 0 | 0 | 0 | 0 |
| 22.11.2023 20:00 - 21:00 | 0 | 0 | 0 | 0 |
| 22.11.2023 21:00 - 22:00 | 0 | 0 | 0 | 0 |
| 22.11.2023 22:00 - 23:00 | 0 | 0 | 0 | 0 |
| 22.11.2023 23:00 - 24:00 | 0 | 0 | 0 | 0 |
| 23.11.2023 00:00 - 01:00 | 0 | 0 | 0 | 0 |
| 23.11.2023 01:00 - 02:00 | 0 | 0 | 0 | 0 |
| 23.11.2023 02:00 - 03:00 | 0 | -220 | 0 | 0 |
| 23.11.2023 03:00 - 04:00 | 0 | -220 | 0 | 0 |
| 23.11.2023 04:00 - 05:00 | 0 | -220 | 0 | 0 |
| 23.11.2023 05:00 - 06:00 | 0 | -220 | 0 | 0 |
| 23.11.2023 06:00 - 07:00 | 0 | 0 | 0 | 0 |
| 23.11.2023 07:00 - 08:00 | 0 | 0 | 0 | 0 |
| 23.11.2023 08:00 - 09:00 | 0 | 0 | 0 | 0 |
| 23.11.2023 09:00 - 10:00 | 0 | 0 | 0 | 0 |
| 23.11.2023 10:00 - 11:00 | 0 | 0 | 0 | 0 |
| 23.11.2023 11:00 - 12:00 | 0 | 0 | 0 | 0 |
| 23.11.2023 12:00 - 13:00 | 0 | 0 | 0 | 0 |
| 23.11.2023 13:00 - 14:00 | 0 | 0 | 0 | 0 |
| 23.11.2023 14:00 - 15:00 | 0 | 0 | 0 | 0 |
| 23.11.2023 15:00 - 16:00 | 0 | 0 | 0 | 0 |
| 23.11.2023 16:00 - 17:00 | 0 | 0 | 0 | 0 |
| 23.11.2023 17:00 - 18:00 | 0 | 0 | 0 | 0 |
| 23.11.2023 18:00 - 19:00 | 0 | 0 | 0 | 0 |
| 23.11.2023 19:00 - 20:00 | 0 | 0 | 0 | 0 |
| 23.11.2023 20:00 - 21:00 | 0 | 0 | 0 | 0 |
| 23.11.2023 21:00 - 22:00 | 0 | 0 | 0 | 0 |
| 23.11.2023 22:00 - 23:00 | 0 | -60 | 0 | 0 |
| 23.11.2023 23:00 - 24:00 | 0 | -60 | 0 | 0 |
| 24.11.2023 00:00 - 01:00 | 0 | -60 | 0 | 0 |
| 24.11.2023 01:00 - 02:00 | 0 | -60 | 0 | 0 |
| 24.11.2023 02:00 - 03:00 | 0 | -240 | 0 | 0 |
| 24.11.2023 03:00 - 04:00 | 0 | -240 | 0 | 0 |
| 24.11.2023 04:00 - 05:00 | 0 | -240 | 0 | 0 |
| 24.11.2023 05:00 - 06:00 | 0 | -240 | 0 | 0 |
| 24.11.2023 06:00 - 07:00 | 0 | 0 | 0 | 0 |
| 24.11.2023 07:00 - 08:00 | 0 | 0 | 0 | 0 |
| 24.11.2023 08:00 - 09:00 | 0 | 0 | 0 | 0 |
| 24.11.2023 09:00 - 10:00 | 0 | 0 | 0 | 0 |
| 24.11.2023 10:00 - 11:00 | 0 | 0 | 0 | 0 |
| 24.11.2023 11:00 - 12:00 | 0 | 0 | 0 | 0 |
| 24.11.2023 12:00 - 13:00 | 0 | 0 | 0 | 0 |
| 24.11.2023 13:00 - 14:00 | 0 | 0 | 0 | 0 |
| 24.11.2023 14:00 - 15:00 | 0 | 0 | 0 | 0 |
| 24.11.2023 15:00 - 16:00 | 0 | 0 | 0 | 0 |
| 24.11.2023 16:00 - 17:00 | 0 | 0 | 0 | 0 |
| 24.11.2023 17:00 - 18:00 | 0 | 0 | 0 | 0 |
| 24.11.2023 18:00 - 19:00 | 0 | 0 | 0 | 0 |
| 24.11.2023 19:00 - 20:00 | 0 | 0 | 0 | 0 |
| 24.11.2023 20:00 - 21:00 | 0 | 0 | 0 | 0 |
| 24.11.2023 21:00 - 22:00 | 0 | 0 | 0 | 0 |
| 24.11.2023 22:00 - 23:00 | 0 | 0 | 0 | 0 |
| 24.11.2023 23:00 - 24:00 | 0 | 0 | 0 | 0 |
| 25.11.2023 00:00 - 01:00 | 0 | 0 | 0 | 0 |
| 25.11.2023 01:00 - 02:00 | 0 | 0 | 0 | 0 |
| 25.11.2023 02:00 - 03:00 | 0 | 0 | 0 | 0 |
| 25.11.2023 03:00 - 04:00 | 0 | 0 | 0 | 0 |
| 25.11.2023 04:00 - 05:00 | 0 | 0 | 0 | 0 |
| 25.11.2023 05:00 - 06:00 | 0 | 0 | 0 | 0 |
| 25.11.2023 06:00 - 07:00 | 0 | 0 | 0 | 0 |
| 25.11.2023 07:00 - 08:00 | 30 | 0 | 0 | 0 |
| 25.11.2023 08:00 - 09:00 | 30 | 0 | 0 | 0 |
| 25.11.2023 09:00 - 10:00 | 30 | 0 | 0 | 0 |
| 25.11.2023 10:00 - 11:00 | 30 | 0 | 0 | 0 |
| 25.11.2023 11:00 - 12:00 | 30 | 0 | 0 | 0 |
| 25.11.2023 12:00 - 13:00 | 30 | 0 | 0 | 0 |
| 25.11.2023 13:00 - 14:00 | 30 | 0 | 0 | 0 |
| 25.11.2023 14:00 - 15:00 | 30 | 0 | 0 | 0 |
| 25.11.2023 15:00 - 16:00 | 30 | 0 | 0 | 0 |
| 25.11.2023 16:00 - 17:00 | 30 | 0 | 0 | 0 |
| 25.11.2023 17:00 - 18:00 | 30 | 0 | 0 | 0 |
| 25.11.2023 18:00 - 19:00 | 30 | 0 | 0 | 0 |
| 25.11.2023 19:00 - 20:00 | 30 | 0 | 0 | 0 |
| 25.11.2023 20:00 - 21:00 | 30 | 0 | 0 | 0 |
| 25.11.2023 21:00 - 22:00 | 30 | 0 | 0 | 0 |
| 25.11.2023 22:00 - 23:00 | 30 | 0 | 0 | 0 |
| 25.11.2023 23:00 - 24:00 | 30 | 0 | 0 | 0 |
| 26.11.2023 00:00 - 01:00 | 30 | -30 | 0 | 0 |
| 26.11.2023 01:00 - 02:00 | 30 | -30 | 0 | 0 |
| 26.11.2023 02:00 - 03:00 | 30 | -30 | 0 | 0 |
| 26.11.2023 03:00 - 04:00 | 30 | -60 | 0 | 0 |
| 26.11.2023 04:00 - 05:00 | 30 | -60 | 0 | 0 |
| 26.11.2023 05:00 - 06:00 | 30 | -60 | 0 | 0 |
| 26.11.2023 06:00 - 07:00 | 0 | 0 | 0 | 0 |
| 26.11.2023 07:00 - 08:00 | 0 | 0 | 0 | 0 |
| 26.11.2023 08:00 - 09:00 | 0 | 0 | 0 | 0 |
| 26.11.2023 09:00 - 10:00 | 0 | 0 | 0 | 0 |
| 26.11.2023 10:00 - 11:00 | 0 | 0 | 0 | 0 |
| 26.11.2023 11:00 - 12:00 | 0 | 0 | 0 | 0 |
| 26.11.2023 12:00 - 13:00 | 0 | 0 | 0 | 0 |
| 26.11.2023 13:00 - 14:00 | 0 | 0 | 0 | 0 |
| 26.11.2023 14:00 - 15:00 | 0 | 0 | 0 | 0 |
| 26.11.2023 15:00 - 16:00 | 0 | 0 | 0 | 0 |
| 26.11.2023 16:00 - 17:00 | 0 | 0 | 0 | 0 |
| 26.11.2023 17:00 - 18:00 | 0 | 0 | 0 | 0 |
| 26.11.2023 18:00 - 19:00 | 0 | 0 | 0 | 0 |
| 26.11.2023 19:00 - 20:00 | 0 | 0 | 0 | 0 |
| 26.11.2023 20:00 - 21:00 | 0 | -50 | 0 | 0 |
| 26.11.2023 21:00 - 22:00 | 0 | -50 | 0 | 0 |
| 26.11.2023 22:00 - 23:00 | 0 | -50 | 0 | 0 |
| 26.11.2023 23:00 - 24:00 | 0 | -50 | 0 | 0 |
| 27.11.2023 00:00 - 01:00 | 0 | -100 | 0 | 0 |
| 27.11.2023 01:00 - 02:00 | 0 | -150 | 0 | 0 |
| 27.11.2023 02:00 - 03:00 | 0 | -150 | 0 | 0 |
| 27.11.2023 03:00 - 04:00 | 0 | -150 | 0 | 0 |
| 27.11.2023 04:00 - 05:00 | 0 | -150 | 0 | 0 |
| 27.11.2023 05:00 - 06:00 | 0 | -150 | 0 | 0 |
| 27.11.2023 06:00 - 07:00 | 0 | 0 | 0 | 0 |
| 27.11.2023 07:00 - 08:00 | 0 | 0 | 0 | 0 |
| 27.11.2023 08:00 - 09:00 | 0 | 0 | 0 | 0 |
| 27.11.2023 09:00 - 10:00 | 0 | 0 | 0 | 0 |
| 27.11.2023 10:00 - 11:00 | 0 | 0 | 0 | 0 |
| 27.11.2023 11:00 - 12:00 | 0 | 0 | 0 | 0 |
| 27.11.2023 12:00 - 13:00 | 0 | 0 | 0 | 0 |
| 27.11.2023 13:00 - 14:00 | 0 | 0 | 0 | 0 |
| 27.11.2023 14:00 - 15:00 | 0 | 0 | 0 | 0 |
| 27.11.2023 15:00 - 16:00 | 0 | -30 | 0 | 0 |
| 27.11.2023 16:00 - 17:00 | 0 | -30 | 0 | 0 |
| 27.11.2023 17:00 - 18:00 | 0 | -30 | 0 | 0 |
| 27.11.2023 18:00 - 19:00 | 0 | -30 | 0 | 0 |
| 27.11.2023 19:00 - 20:00 | 0 | -30 | 0 | 0 |
| 27.11.2023 20:00 - 21:00 | 0 | -30 | 0 | 0 |
| 27.11.2023 21:00 - 22:00 | 0 | -30 | 0 | 0 |
| 27.11.2023 22:00 - 23:00 | 0 | -30 | 0 | 0 |
| 27.11.2023 23:00 - 24:00 | 0 | -30 | 0 | 0 |
| 28.11.2023 00:00 - 01:00 | 0 | -80 | 0 | 0 |
| 28.11.2023 01:00 - 02:00 | 0 | -80 | 0 | 0 |
| 28.11.2023 02:00 - 03:00 | 0 | -150 | 0 | 0 |
| 28.11.2023 03:00 - 04:00 | 0 | -150 | 0 | 0 |
| 28.11.2023 04:00 - 05:00 | 0 | -150 | 0 | 0 |
| 28.11.2023 05:00 - 06:00 | 0 | -150 | 0 | 0 |
| 28.11.2023 06:00 - 07:00 | 0 | 0 | 0 | 0 |
| 28.11.2023 07:00 - 08:00 | 0 | 0 | 0 | 0 |
| 28.11.2023 08:00 - 09:00 | 0 | 0 | 0 | 0 |
| 28.11.2023 09:00 - 10:00 | 0 | 0 | 0 | 0 |
| 28.11.2023 10:00 - 11:00 | 0 | 0 | 0 | 0 |
| 28.11.2023 11:00 - 12:00 | 0 | 0 | 0 | 0 |
| 28.11.2023 12:00 - 13:00 | 0 | 0 | 0 | 0 |
| 28.11.2023 13:00 - 14:00 | 0 | 0 | 0 | 0 |
| 28.11.2023 14:00 - 15:00 | 0 | 0 | 0 | 0 |
| 28.11.2023 15:00 - 16:00 | 0 | 0 | 0 | 0 |
| 28.11.2023 16:00 - 17:00 | 0 | -100 | 0 | 0 |
| 28.11.2023 17:00 - 18:00 | 0 | -100 | 0 | 0 |
| 28.11.2023 18:00 - 19:00 | 0 | -100 | 0 | 0 |
| 28.11.2023 19:00 - 20:00 | 0 | -100 | 0 | 0 |
| 28.11.2023 20:00 - 21:00 | 0 | -100 | 0 | 0 |
| 28.11.2023 21:00 - 22:00 | 0 | -100 | 0 | 0 |
| 28.11.2023 22:00 - 23:00 | 0 | -100 | 0 | 0 |
| 28.11.2023 23:00 - 24:00 | 0 | -100 | 0 | 0 |
| 29.11.2023 00:00 - 01:00 | 0 | -100 | 0 | 0 |
| 29.11.2023 01:00 - 02:00 | 0 | -100 | 0 | 0 |
| 29.11.2023 02:00 - 03:00 | 80 | -100 | 0 | 0 |
| 29.11.2023 03:00 - 04:00 | 80 | -100 | 0 | 0 |
| 29.11.2023 04:00 - 05:00 | 80 | -100 | 0 | 0 |
| 29.11.2023 05:00 - 06:00 | 80 | -100 | 0 | 0 |
| 29.11.2023 06:00 - 07:00 | 0 | 0 | 0 | 0 |
| 29.11.2023 07:00 - 08:00 | 0 | 0 | 0 | 0 |
| 29.11.2023 08:00 - 09:00 | 0 | 0 | 0 | 0 |
| 29.11.2023 09:00 - 10:00 | 0 | 0 | 0 | 0 |
| 29.11.2023 10:00 - 11:00 | 0 | 0 | 0 | 0 |
| 29.11.2023 11:00 - 12:00 | 0 | 0 | 0 | 0 |
| 29.11.2023 12:00 - 13:00 | 0 | 0 | 0 | 0 |
| 29.11.2023 13:00 - 14:00 | 0 | 0 | 0 | 0 |
| 29.11.2023 14:00 - 15:00 | 0 | 0 | 0 | 0 |
| 29.11.2023 15:00 - 16:00 | 0 | 0 | 0 | 0 |
| 29.11.2023 16:00 - 17:00 | 0 | 0 | 0 | 0 |
| 29.11.2023 17:00 - 18:00 | 0 | 0 | 0 | 0 |
| 29.11.2023 18:00 - 19:00 | 0 | 0 | 0 | 0 |
| 29.11.2023 19:00 - 20:00 | 0 | -50 | 0 | 0 |
| 29.11.2023 20:00 - 21:00 | 0 | -50 | 0 | 0 |
| 29.11.2023 21:00 - 22:00 | 0 | -50 | 0 | 0 |
| 29.11.2023 22:00 - 23:00 | 0 | -150 | 0 | 0 |
| 29.11.2023 23:00 - 24:00 | 0 | -230 | 0 | 0 |
| 30.11.2023 00:00 - 01:00 | 0 | -270 | 0 | 0 |
| 30.11.2023 01:00 - 02:00 | 0 | -270 | 0 | 0 |
| 30.11.2023 02:00 - 03:00 | 0 | -270 | 0 | 0 |
| 30.11.2023 03:00 - 04:00 | 270 | -270 | 0 | 0 |
| 30.11.2023 04:00 - 05:00 | 270 | -270 | 0 | 0 |
| 30.11.2023 05:00 - 06:00 | 270 | -270 | 0 | 0 |
| 30.11.2023 06:00 - 07:00 | 0 | 0 | 0 | 0 |
| 30.11.2023 07:00 - 08:00 | 0 | 0 | 0 | 0 |
| 30.11.2023 08:00 - 09:00 | 0 | 0 | 0 | 0 |
| 30.11.2023 09:00 - 10:00 | 0 | 0 | 0 | 0 |
| 30.11.2023 10:00 - 11:00 | 0 | 0 | 0 | 0 |
| 30.11.2023 11:00 - 12:00 | 0 | 0 | 0 | 0 |
| 30.11.2023 12:00 - 13:00 | 0 | 0 | 0 | 0 |
| 30.11.2023 13:00 - 14:00 | 0 | 0 | 0 | 0 |
| 30.11.2023 14:00 - 15:00 | 0 | 0 | 0 | 0 |
| 30.11.2023 15:00 - 16:00 | 0 | 0 | 0 | 0 |
| 30.11.2023 16:00 - 17:00 | 0 | 0 | 0 | 0 |
| 30.11.2023 17:00 - 18:00 | 0 | 0 | 0 | 0 |
| 30.11.2023 18:00 - 19:00 | 0 | 0 | 0 | 0 |
| 30.11.2023 19:00 - 20:00 | 0 | 0 | 0 | 0 |
| 30.11.2023 20:00 - 21:00 | 0 | 0 | 0 | 0 |
| 30.11.2023 21:00 - 22:00 | 0 | 0 | 0 | 0 |
| 30.11.2023 22:00 - 23:00 | 0 | 0 | 0 | 0 |
| 30.11.2023 23:00 - 24:00 | 0 | 0 | 0 | 0 |
| 01.12.2023 00:00 - 01:00 | 0 | 0 | 0 | 0 |
| 01.12.2023 01:00 - 02:00 | 0 | 0 | 0 | 0 |
| 01.12.2023 02:00 - 03:00 | 0 | 0 | 0 | 0 |
| 01.12.2023 03:00 - 04:00 | 0 | 0 | 0 | 0 |
| 01.12.2023 04:00 - 05:00 | 0 | 0 | 0 | 0 |
| 01.12.2023 05:00 - 06:00 | 0 | 0 | 0 | 0 |